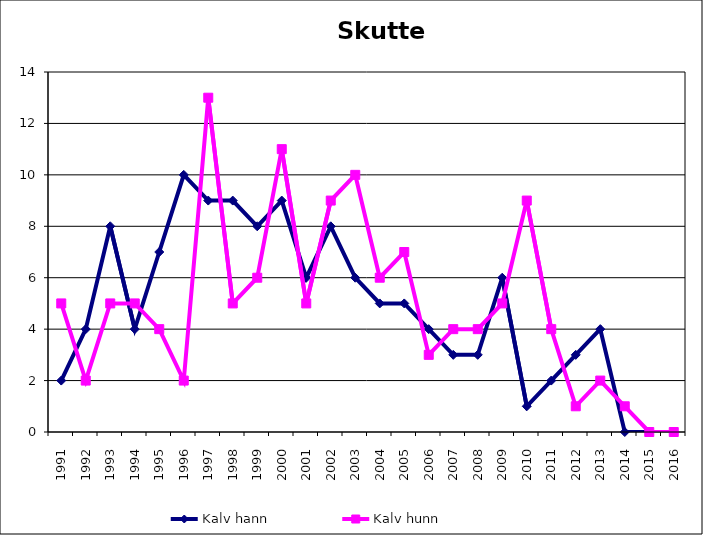
| Category | Kalv |
|---|---|
| 1991.0 | 5 |
| 1992.0 | 2 |
| 1993.0 | 5 |
| 1994.0 | 5 |
| 1995.0 | 4 |
| 1996.0 | 2 |
| 1997.0 | 13 |
| 1998.0 | 5 |
| 1999.0 | 6 |
| 2000.0 | 11 |
| 2001.0 | 5 |
| 2002.0 | 9 |
| 2003.0 | 10 |
| 2004.0 | 6 |
| 2005.0 | 7 |
| 2006.0 | 3 |
| 2007.0 | 4 |
| 2008.0 | 4 |
| 2009.0 | 5 |
| 2010.0 | 9 |
| 2011.0 | 4 |
| 2012.0 | 1 |
| 2013.0 | 2 |
| 2014.0 | 1 |
| 2015.0 | 0 |
| 2016.0 | 0 |